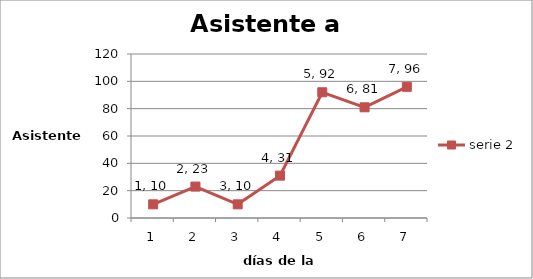
| Category | serie 2 |
|---|---|
| 1.0 | 10 |
| 2.0 | 23 |
| 3.0 | 10 |
| 4.0 | 31 |
| 5.0 | 92 |
| 6.0 | 81 |
| 7.0 | 96 |